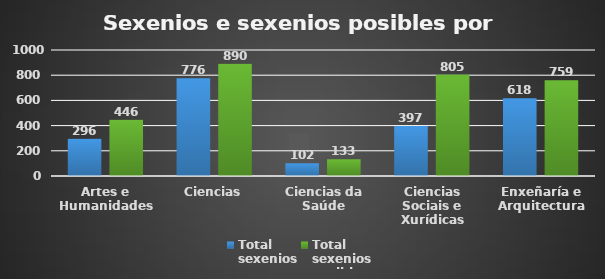
| Category | Total
sexenios | Total
sexenios
posibles |
|---|---|---|
| Artes e Humanidades | 296 | 446 |
| Ciencias | 776 | 890 |
| Ciencias da Saúde | 102 | 133 |
| Ciencias Sociais e Xurídicas | 397 | 805 |
| Enxeñaría e Arquitectura | 618 | 759 |